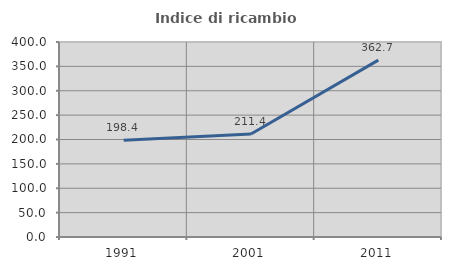
| Category | Indice di ricambio occupazionale  |
|---|---|
| 1991.0 | 198.413 |
| 2001.0 | 211.429 |
| 2011.0 | 362.745 |